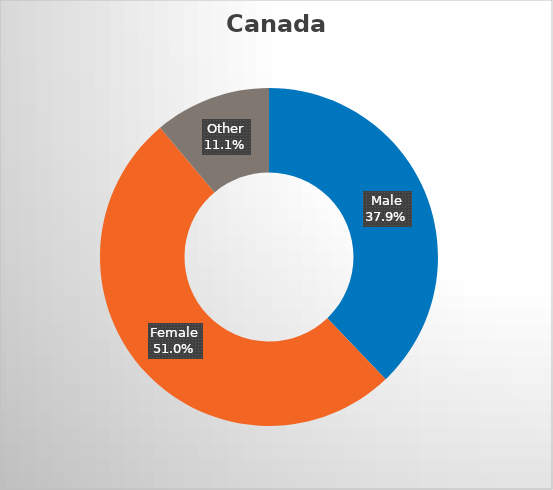
| Category | Canada |
|---|---|
| Male | 0.379 |
| Female | 0.51 |
| Other | 0.111 |